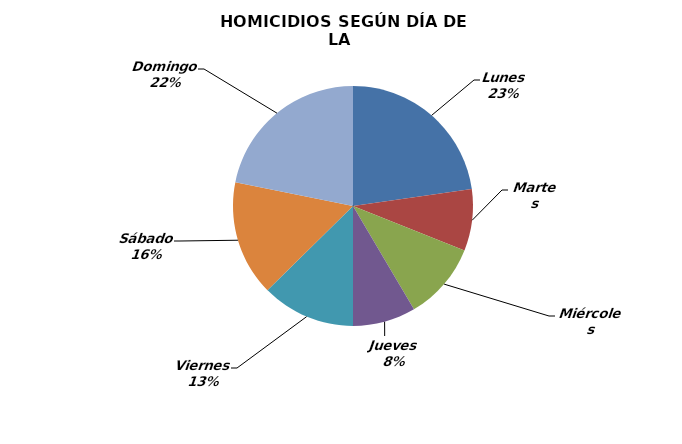
| Category | Series 0 |
|---|---|
| Lunes | 126 |
| Martes | 46 |
| Miércoles | 58 |
| Jueves | 47 |
| Viernes | 70 |
| Sábado | 86 |
| Domingo | 121 |